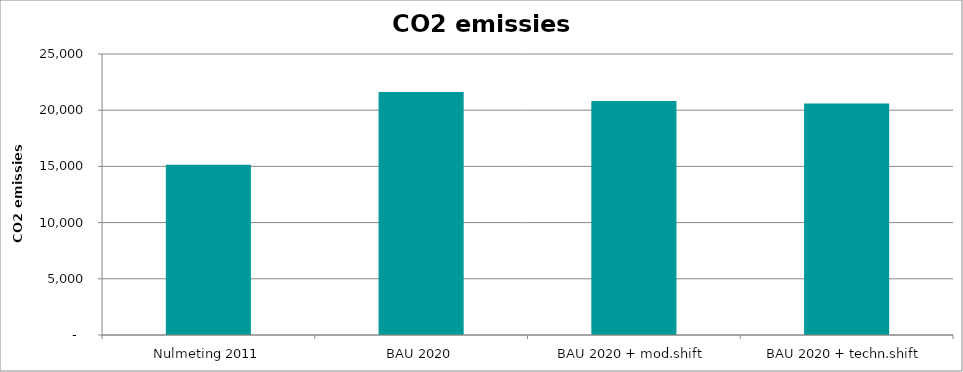
| Category | Series 0 |
|---|---|
| Nulmeting 2011 | 15154.35 |
| BAU 2020 | 21629.947 |
| BAU 2020 + mod.shift | 20814.18 |
| BAU 2020 + techn.shift | 20592.192 |